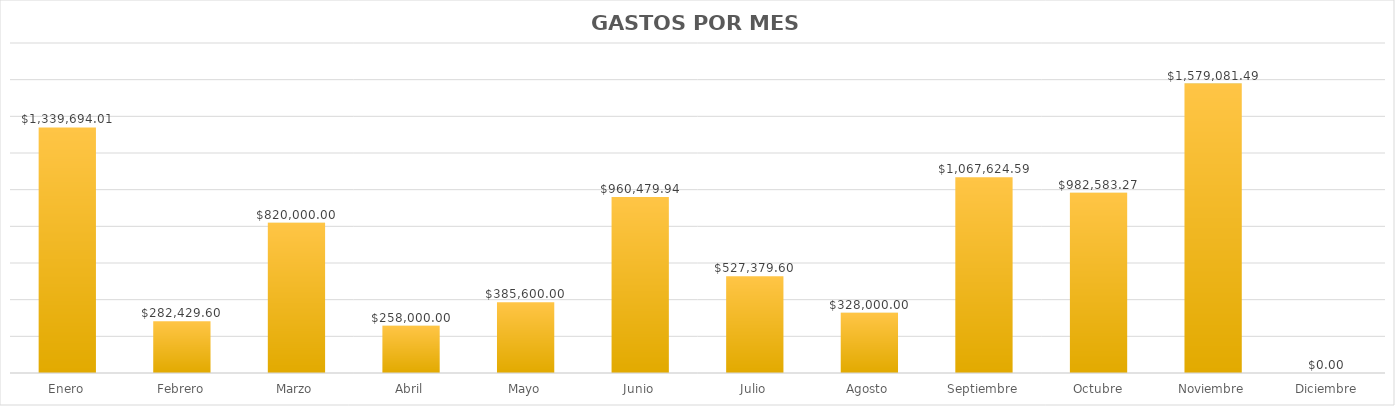
| Category | Series 0 |
|---|---|
| Enero | 1339694.01 |
| Febrero | 282429.6 |
| Marzo | 820000 |
| Abril | 258000 |
| Mayo | 385600 |
| Junio | 960479.94 |
| Julio | 527379.6 |
| Agosto | 328000 |
| Septiembre | 1067624.59 |
| Octubre | 982583.27 |
| Noviembre | 1579081.49 |
| Diciembre | 0 |